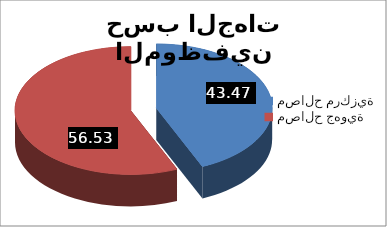
| Category | توزيع الموظفين حسب الجهات |
|---|---|
| مصالح مركزية | 43.471 |
| مصالح جهوية | 56.529 |